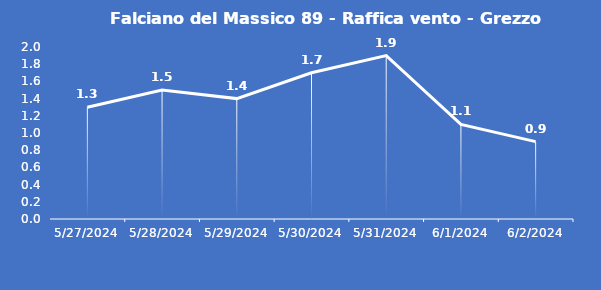
| Category | Falciano del Massico 89 - Raffica vento - Grezzo (m/s) |
|---|---|
| 5/27/24 | 1.3 |
| 5/28/24 | 1.5 |
| 5/29/24 | 1.4 |
| 5/30/24 | 1.7 |
| 5/31/24 | 1.9 |
| 6/1/24 | 1.1 |
| 6/2/24 | 0.9 |